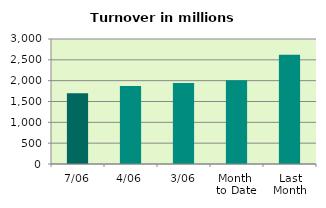
| Category | Series 0 |
|---|---|
| 7/06 | 1699.671 |
| 4/06 | 1871.615 |
| 3/06 | 1944.724 |
| Month 
to Date | 2012 |
| Last
Month | 2619.784 |